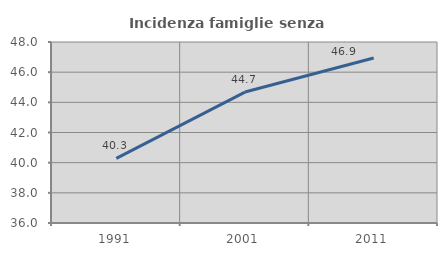
| Category | Incidenza famiglie senza nuclei |
|---|---|
| 1991.0 | 40.29 |
| 2001.0 | 44.681 |
| 2011.0 | 46.939 |